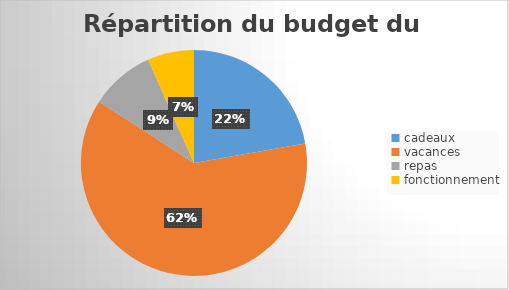
| Category | montant |
|---|---|
| cadeaux | 1400 |
| vacances | 3900 |
| repas | 580 |
| fonctionnement | 420 |